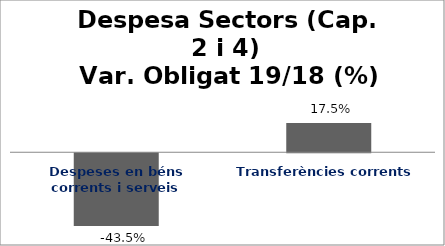
| Category | Series 0 |
|---|---|
| Despeses en béns corrents i serveis | -0.435 |
| Transferències corrents | 0.175 |